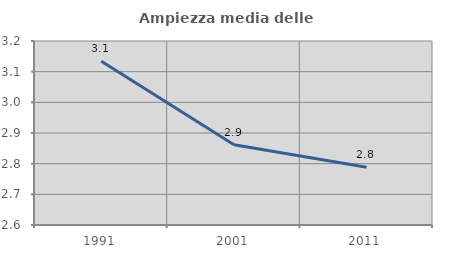
| Category | Ampiezza media delle famiglie |
|---|---|
| 1991.0 | 3.134 |
| 2001.0 | 2.861 |
| 2011.0 | 2.788 |